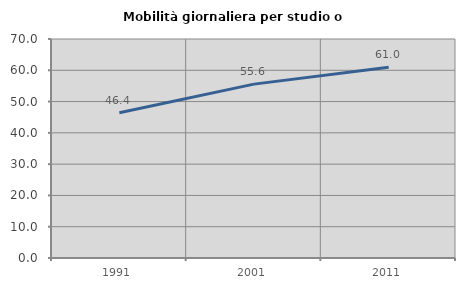
| Category | Mobilità giornaliera per studio o lavoro |
|---|---|
| 1991.0 | 46.448 |
| 2001.0 | 55.575 |
| 2011.0 | 60.965 |